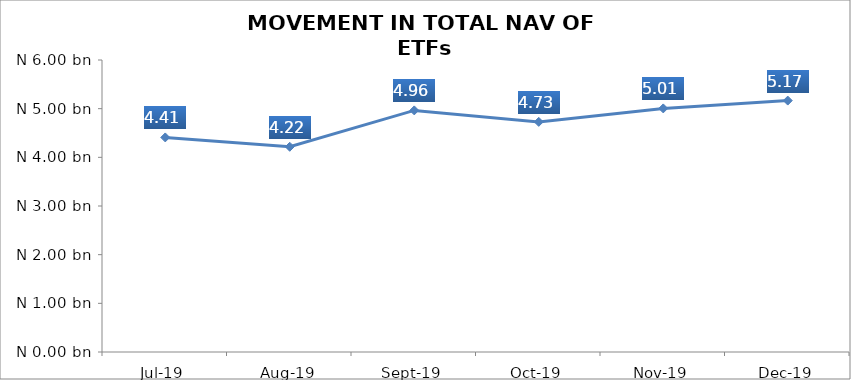
| Category | Series 0 |
|---|---|
| 2019-07-01 | 4409094037.91 |
| 2019-08-01 | 4217039446.38 |
| 2019-09-01 | 4964397793.06 |
| 2019-10-01 | 4728711300.68 |
| 2019-11-01 | 5005279567.02 |
| 2019-12-01 | 5165913992.06 |